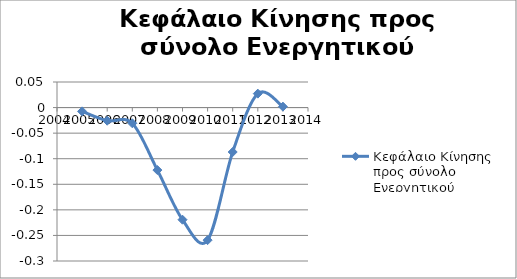
| Category | Κεφάλαιο Κίνησης προς σύνολο Ενεργητικού |
|---|---|
| 2005.0 | -0.007 |
| 2006.0 | -0.026 |
| 2007.0 | -0.031 |
| 2008.0 | -0.122 |
| 2009.0 | -0.219 |
| 2010.0 | -0.259 |
| 2011.0 | -0.087 |
| 2012.0 | 0.027 |
| 2013.0 | 0.002 |